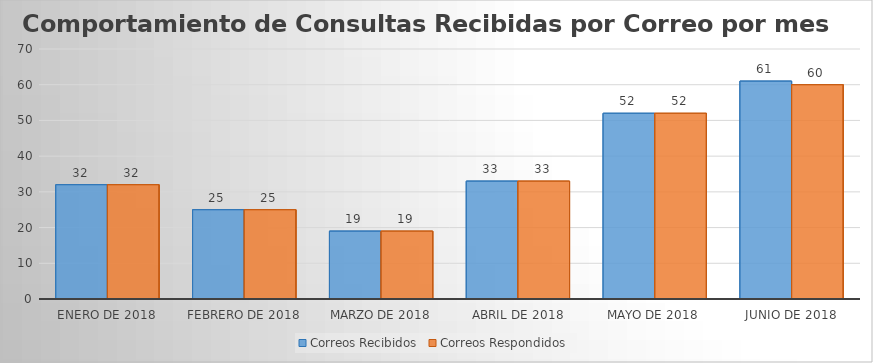
| Category | Correos Recibidos | Correos Respondidos |
|---|---|---|
| Enero de 2018 | 32 | 32 |
| Febrero de 2018 | 25 | 25 |
| Marzo de 2018 | 19 | 19 |
| Abril de 2018 | 33 | 33 |
| Mayo de 2018 | 52 | 52 |
| Junio de 2018 | 61 | 60 |